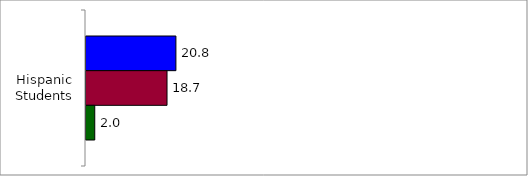
| Category | 50 States and D.C. | SREB States | State |
|---|---|---|---|
| 0 | 20.765 | 18.711 | 2.024 |